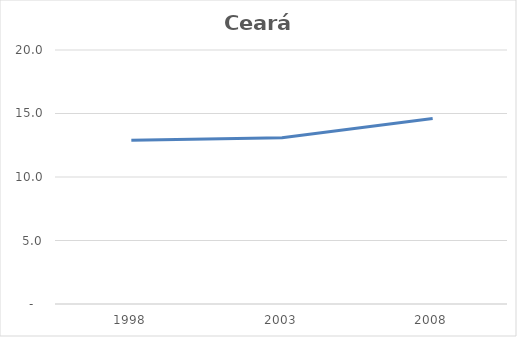
| Category | Ceará |
|---|---|
| 1998.0 | 12.9 |
| 2003.0 | 13.1 |
| 2008.0 | 14.6 |